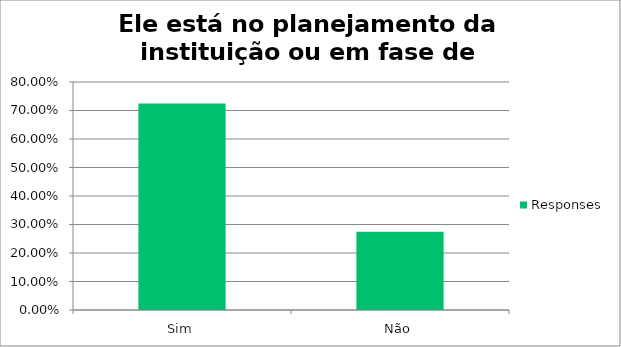
| Category | Responses |
|---|---|
| Sim | 0.725 |
| Não | 0.275 |